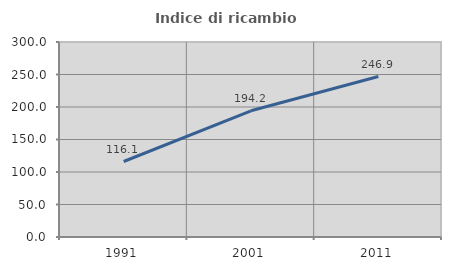
| Category | Indice di ricambio occupazionale  |
|---|---|
| 1991.0 | 116.139 |
| 2001.0 | 194.152 |
| 2011.0 | 246.907 |